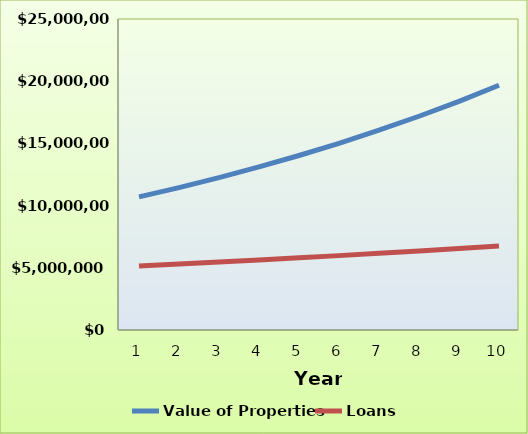
| Category | Value of Properties | Loans |
|---|---|---|
| 0 | 10700000 | 5150000 |
| 1 | 11449000 | 5305000 |
| 2 | 12250430 | 5465187.5 |
| 3 | 13107960.1 | 5630757.812 |
| 4 | 14025517.307 | 5801914.414 |
| 5 | 15007303.518 | 5978869.313 |
| 6 | 16057814.765 | 6161843.437 |
| 7 | 17181861.798 | 6351067.034 |
| 8 | 18384592.124 | 6546780.096 |
| 9 | 19671513.573 | 6749232.804 |